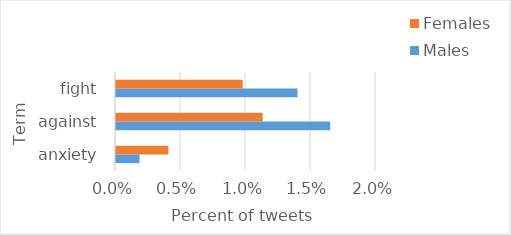
| Category | Males | Females |
|---|---|---|
| anxiety | 0.002 | 0.004 |
| against | 0.016 | 0.011 |
| fight | 0.014 | 0.01 |